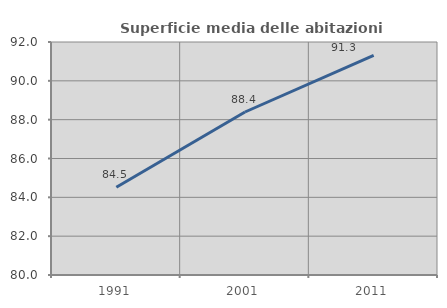
| Category | Superficie media delle abitazioni occupate |
|---|---|
| 1991.0 | 84.518 |
| 2001.0 | 88.395 |
| 2011.0 | 91.317 |